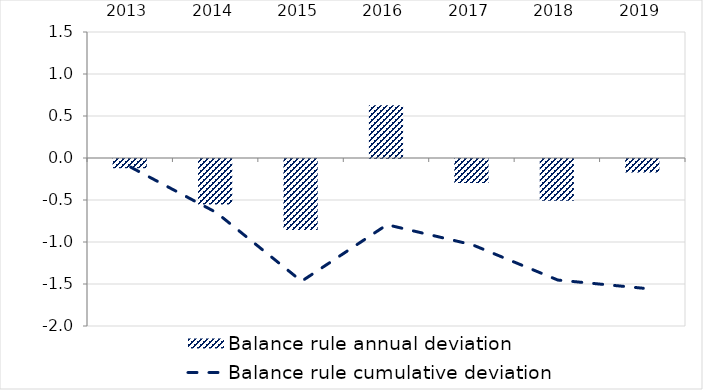
| Category | Balance rule annual deviation |
|---|---|
| 2013.0 | -0.109 |
| 2014.0 | -0.542 |
| 2015.0 | -0.845 |
| 2016.0 | 0.627 |
| 2017.0 | -0.286 |
| 2018.0 | -0.497 |
| 2019.0 | -0.161 |